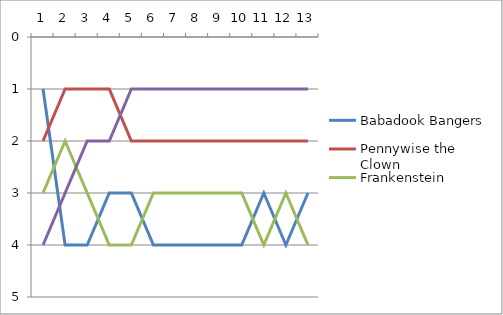
| Category | Babadook Bangers | Pennywise the Clown | Frankenstein | Pat's Video Rentals |
|---|---|---|---|---|
| 0 | 1 | 2 | 3 | 4 |
| 1 | 4 | 1 | 2 | 3 |
| 2 | 4 | 1 | 3 | 2 |
| 3 | 3 | 1 | 4 | 2 |
| 4 | 3 | 2 | 4 | 1 |
| 5 | 4 | 2 | 3 | 1 |
| 6 | 4 | 2 | 3 | 1 |
| 7 | 4 | 2 | 3 | 1 |
| 8 | 4 | 2 | 3 | 1 |
| 9 | 4 | 2 | 3 | 1 |
| 10 | 3 | 2 | 4 | 1 |
| 11 | 4 | 2 | 3 | 1 |
| 12 | 3 | 2 | 4 | 1 |